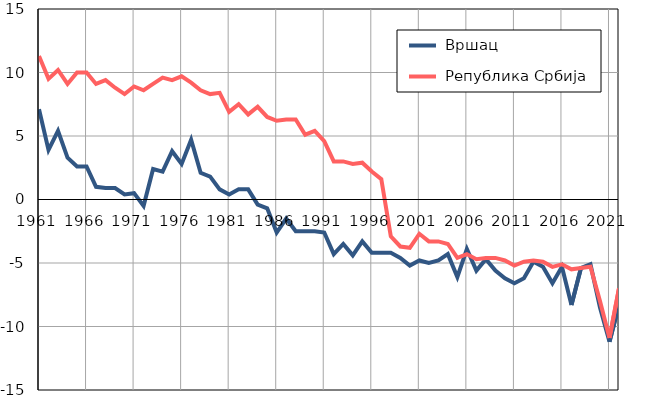
| Category |  Вршац |  Република Србија |
|---|---|---|
| 1961.0 | 7.1 | 11.3 |
| 1962.0 | 3.9 | 9.5 |
| 1963.0 | 5.4 | 10.2 |
| 1964.0 | 3.3 | 9.1 |
| 1965.0 | 2.6 | 10 |
| 1966.0 | 2.6 | 10 |
| 1967.0 | 1 | 9.1 |
| 1968.0 | 0.9 | 9.4 |
| 1969.0 | 0.9 | 8.8 |
| 1970.0 | 0.4 | 8.3 |
| 1971.0 | 0.5 | 8.9 |
| 1972.0 | -0.5 | 8.6 |
| 1973.0 | 2.4 | 9.1 |
| 1974.0 | 2.2 | 9.6 |
| 1975.0 | 3.8 | 9.4 |
| 1976.0 | 2.8 | 9.7 |
| 1977.0 | 4.7 | 9.2 |
| 1978.0 | 2.1 | 8.6 |
| 1979.0 | 1.8 | 8.3 |
| 1980.0 | 0.8 | 8.4 |
| 1981.0 | 0.4 | 6.9 |
| 1982.0 | 0.8 | 7.5 |
| 1983.0 | 0.8 | 6.7 |
| 1984.0 | -0.4 | 7.3 |
| 1985.0 | -0.7 | 6.5 |
| 1986.0 | -2.6 | 6.2 |
| 1987.0 | -1.5 | 6.3 |
| 1988.0 | -2.5 | 6.3 |
| 1989.0 | -2.5 | 5.1 |
| 1990.0 | -2.5 | 5.4 |
| 1991.0 | -2.6 | 4.6 |
| 1992.0 | -4.3 | 3 |
| 1993.0 | -3.5 | 3 |
| 1994.0 | -4.4 | 2.8 |
| 1995.0 | -3.3 | 2.9 |
| 1996.0 | -4.2 | 2.2 |
| 1997.0 | -4.2 | 1.6 |
| 1998.0 | -4.2 | -2.9 |
| 1999.0 | -4.6 | -3.7 |
| 2000.0 | -5.2 | -3.8 |
| 2001.0 | -4.8 | -2.7 |
| 2002.0 | -5 | -3.3 |
| 2003.0 | -4.8 | -3.3 |
| 2004.0 | -4.3 | -3.5 |
| 2005.0 | -6.1 | -4.6 |
| 2006.0 | -3.9 | -4.3 |
| 2007.0 | -5.6 | -4.7 |
| 2008.0 | -4.7 | -4.6 |
| 2009.0 | -5.6 | -4.6 |
| 2010.0 | -6.2 | -4.8 |
| 2011.0 | -6.6 | -5.2 |
| 2012.0 | -6.2 | -4.9 |
| 2013.0 | -4.9 | -4.8 |
| 2014.0 | -5.3 | -4.9 |
| 2015.0 | -6.6 | -5.3 |
| 2016.0 | -5.3 | -5.1 |
| 2017.0 | -8.3 | -5.5 |
| 2018.0 | -5.4 | -5.4 |
| 2019.0 | -5.1 | -5.3 |
| 2020.0 | -8.5 | -8 |
| 2021.0 | -11.2 | -10.9 |
| 2022.0 | -8.3 | -7 |